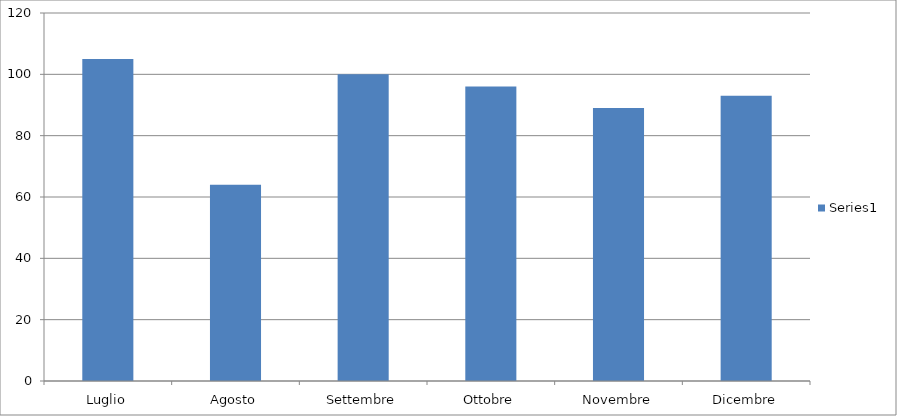
| Category | Series 0 |
|---|---|
| Luglio | 105 |
| Agosto | 64 |
| Settembre | 100 |
| Ottobre | 96 |
| Novembre | 89 |
| Dicembre | 93 |